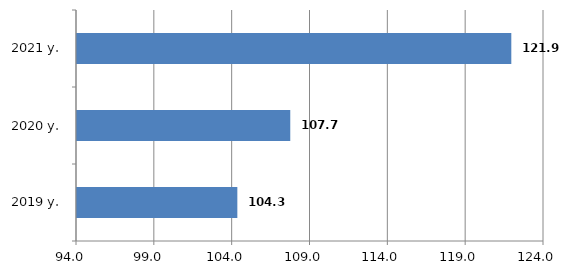
| Category | Series 0 |
|---|---|
| 2019 y. | 104.3 |
| 2020 y. | 107.7 |
| 2021 y. | 121.9 |